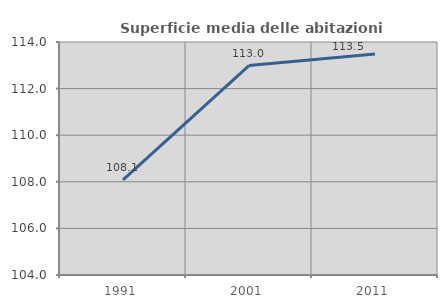
| Category | Superficie media delle abitazioni occupate |
|---|---|
| 1991.0 | 108.084 |
| 2001.0 | 112.987 |
| 2011.0 | 113.484 |